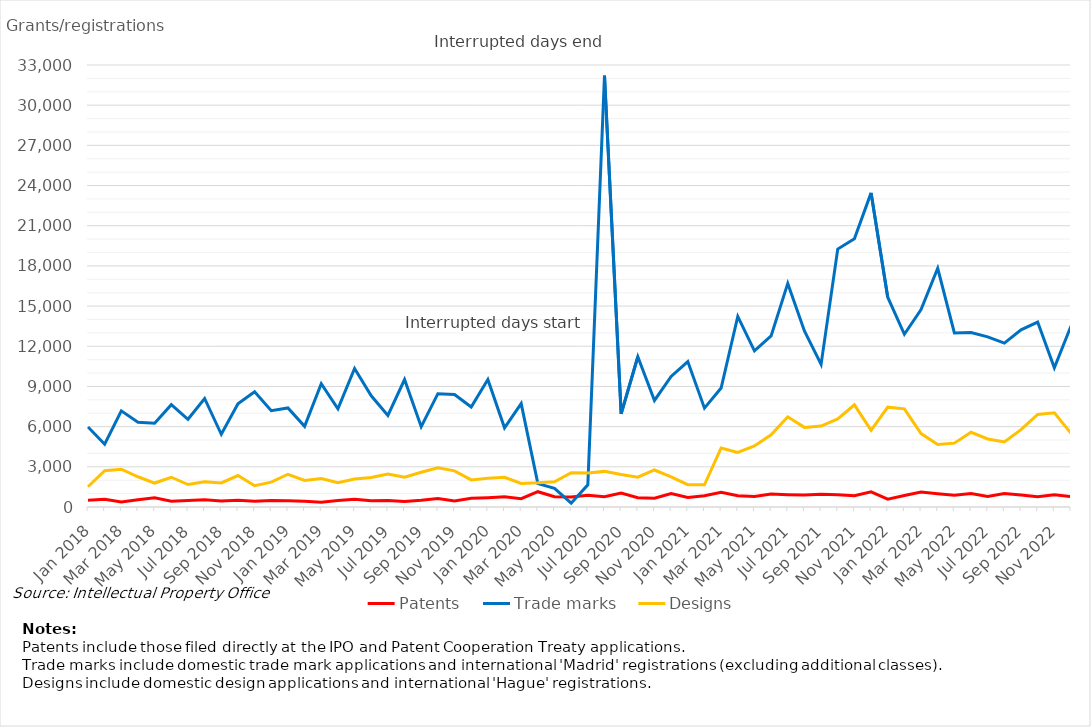
| Category | Patents | Trade marks | Designs |
|---|---|---|---|
| Jan 2018 | 495 | 5979 | 1512 |
| Feb 2018 | 574 | 4687 | 2704 |
| Mar 2018 | 370 | 7179 | 2825 |
| Apr 2018 | 543 | 6334 | 2259 |
| May 2018 | 690 | 6253 | 1789 |
| Jun 2018 | 424 | 7637 | 2222 |
| Jul 2018 | 486 | 6551 | 1678 |
| Aug 2018 | 536 | 8104 | 1878 |
| Sep 2018 | 450 | 5429 | 1795 |
| Oct 2018 | 498 | 7701 | 2348 |
| Nov 2018 | 432 | 8604 | 1592 |
| Dec 2018 | 484 | 7192 | 1859 |
| Jan 2019 | 474 | 7393 | 2444 |
| Feb 2019 | 426 | 6023 | 1987 |
| Mar 2019 | 363 | 9208 | 2125 |
| Apr 2019 | 488 | 7336 | 1810 |
| May 2019 | 573 | 10344 | 2096 |
| Jun 2019 | 471 | 8304 | 2202 |
| Jul 2019 | 489 | 6840 | 2464 |
| Aug 2019 | 420 | 9518 | 2218 |
| Sep 2019 | 500 | 5992 | 2596 |
| Oct 2019 | 634 | 8460 | 2926 |
| Nov 2019 | 455 | 8403 | 2700 |
| Dec 2019 | 654 | 7465 | 2021 |
| Jan 2020 | 696 | 9525 | 2145 |
| Feb 2020 | 756 | 5909 | 2220 |
| Mar 2020 | 622 | 7722 | 1757 |
| Apr 2020 | 1143 | 1742 | 1803 |
| May 2020 | 768 | 1399 | 1888 |
| Jun 2020 | 740 | 282 | 2564 |
| Jul 2020 | 878 | 1659 | 2539 |
| Aug 2020 | 771 | 32204 | 2659 |
| Sep 2020 | 1042 | 6950 | 2425 |
| Oct 2020 | 697 | 11221 | 2223 |
| Nov 2020 | 649 | 7956 | 2763 |
| Dec 2020 | 1010 | 9750 | 2252 |
| Jan 2021 | 708 | 10856 | 1665 |
| Feb 2021 | 838 | 7381 | 1660 |
| Mar 2021 | 1107 | 8879 | 4408 |
| Apr 2021 | 838 | 14233 | 4074 |
| May 2021 | 788 | 11655 | 4562 |
| Jun 2021 | 972 | 12777 | 5385 |
| Jul 2021 | 918 | 16695 | 6731 |
| Aug 2021 | 887 | 13147 | 5944 |
| Sep 2021 | 947 | 10649 | 6041 |
| Oct 2021 | 920 | 19255 | 6577 |
| Nov 2021 | 841 | 20030 | 7629 |
| Dec 2021 | 1131 | 23452 | 5719 |
| Jan 2022 | 585 | 15662 | 7455 |
| Feb 2022 | 860 | 12898 | 7329 |
| Mar 2022 | 1111 | 14745 | 5482 |
| Apr 2022 | 990 | 17821 | 4663 |
| May 2022 | 883 | 12994 | 4767 |
| Jun 2022 | 1010 | 13033 | 5579 |
| Jul 2022 | 788 | 12702 | 5082 |
| Aug 2022 | 1007 | 12235 | 4856 |
| Sep 2022 | 889 | 13224 | 5776 |
| Oct 2022 | 758 | 13809 | 6910 |
| Nov 2022 | 920 | 10398 | 7027 |
| Dec 2022 | 777 | 13513 | 5500 |